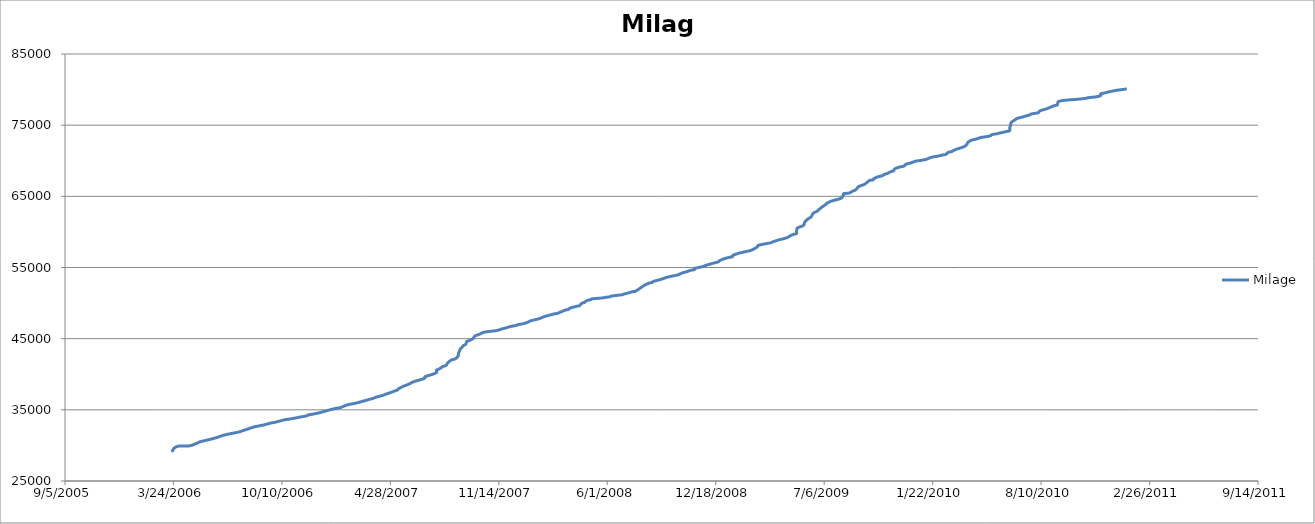
| Category | Milage |
|---|---|
| 38796.0 | 29142 |
| 38799.0 | 29300 |
| 38801.0 | 29600 |
| 38809.0 | 29895 |
| 38831.0 | 29958 |
| 38849.0 | 30505 |
| 38856.0 | 30636 |
| 38868.0 | 30858 |
| 38874.0 | 30979 |
| 38881.0 | 31136 |
| 38892.0 | 31427 |
| 38906.0 | 31661 |
| 38919.0 | 31859 |
| 38925.0 | 31992 |
| 38936.0 | 32274 |
| 38947.0 | 32562 |
| 38961.0 | 32791 |
| 38967.0 | 32882 |
| 38982.0 | 33194 |
| 38985.0 | 33208 |
| 38998.0 | 33465 |
| 39006.0 | 33617 |
| 39017.0 | 33739 |
| 39034.0 | 33988 |
| 39044.0 | 34125 |
| 39050.0 | 34301 |
| 39060.0 | 34436 |
| 39073.0 | 34668 |
| 39084.0 | 34906 |
| 39091.0 | 35045 |
| 39099.0 | 35202 |
| 39108.0 | 35310 |
| 39110.0 | 35381 |
| 39122.0 | 35726 |
| 39133.0 | 35882 |
| 39141.0 | 36031 |
| 39148.0 | 36183 |
| 39155.0 | 36325 |
| 39161.0 | 36466 |
| 39168.0 | 36601 |
| 39173.0 | 36759 |
| 39187.0 | 37054 |
| 39190.0 | 37166 |
| 39197.0 | 37335 |
| 39202.0 | 37474 |
| 39210.0 | 37707 |
| 39213.0 | 37788 |
| 39215.0 | 37974 |
| 39217.0 | 38030 |
| 39223.0 | 38281 |
| 39231.0 | 38514 |
| 39234.0 | 38609 |
| 39243.0 | 38957 |
| 39249.0 | 39078 |
| 39250.0 | 39110 |
| 39263.0 | 39430 |
| 39264.0 | 39651 |
| 39276.0 | 39949 |
| 39285.0 | 40235 |
| 39285.0 | 40581 |
| 39290.0 | 40739 |
| 39297.0 | 41092 |
| 39303.0 | 41252 |
| 39306.0 | 41617 |
| 39313.0 | 42025 |
| 39320.0 | 42165 |
| 39325.0 | 42569 |
| 39325.0 | 42607 |
| 39326.0 | 43007 |
| 39326.0 | 43022 |
| 39328.0 | 43325 |
| 39329.0 | 43577 |
| 39332.0 | 43762 |
| 39334.0 | 43986 |
| 39339.0 | 44218 |
| 39341.0 | 44604 |
| 39346.0 | 44750 |
| 39349.0 | 44852 |
| 39353.0 | 45065 |
| 39356.0 | 45375 |
| 39363.0 | 45576 |
| 39366.0 | 45681 |
| 39371.0 | 45874 |
| 39379.0 | 45987 |
| 39392.0 | 46097 |
| 39402.0 | 46255 |
| 39405.0 | 46361 |
| 39413.0 | 46497 |
| 39417.0 | 46610 |
| 39422.0 | 46718 |
| 39432.0 | 46863 |
| 39436.0 | 46980 |
| 39444.0 | 47089 |
| 39450.0 | 47211 |
| 39454.0 | 47327 |
| 39457.0 | 47459 |
| 39462.0 | 47577 |
| 39469.0 | 47695 |
| 39475.0 | 47826 |
| 39479.0 | 47947 |
| 39483.0 | 48085 |
| 39487.0 | 48170 |
| 39503.0 | 48498 |
| 39507.0 | 48530 |
| 39517.0 | 48837 |
| 39520.0 | 48949 |
| 39525.0 | 49054 |
| 39529.0 | 49145 |
| 39532.0 | 49315 |
| 39539.0 | 49459 |
| 39545.0 | 49573 |
| 39549.0 | 49640 |
| 39551.0 | 49840 |
| 39554.0 | 50000 |
| 39556.0 | 50052 |
| 39557.0 | 50055 |
| 39563.0 | 50366 |
| 39570.0 | 50494 |
| 39572.0 | 50596 |
| 39590.0 | 50713 |
| 39596.0 | 50794 |
| 39605.0 | 50887 |
| 39607.0 | 50972 |
| 39615.0 | 51059 |
| 39628.0 | 51181 |
| 39631.0 | 51273 |
| 39634.0 | 51333 |
| 39639.0 | 51431 |
| 39642.0 | 51500 |
| 39648.0 | 51622 |
| 39653.0 | 51706 |
| 39668.0 | 52484 |
| 39675.0 | 52740 |
| 39678.0 | 52836 |
| 39683.0 | 52896 |
| 39684.0 | 53010 |
| 39691.0 | 53177 |
| 39696.0 | 53266 |
| 39710.0 | 53617 |
| 39715.0 | 53720 |
| 39722.0 | 53827 |
| 39728.0 | 53921 |
| 39730.0 | 53957 |
| 39740.0 | 54283 |
| 39745.0 | 54365 |
| 39750.0 | 54517 |
| 39756.0 | 54638 |
| 39761.0 | 54708 |
| 39761.0 | 54871 |
| 39775.0 | 55109 |
| 39785.0 | 55383 |
| 39793.0 | 55552 |
| 39801.0 | 55708 |
| 39805.0 | 55809 |
| 39808.0 | 56000 |
| 39817.0 | 56269 |
| 39827.0 | 56461 |
| 39831.0 | 56521 |
| 39832.0 | 56726 |
| 39843.0 | 57016 |
| 39853.0 | 57192 |
| 39865.0 | 57407 |
| 39872.0 | 57672 |
| 39877.0 | 57909 |
| 39879.0 | 58127 |
| 39897.0 | 58406 |
| 39900.0 | 58452 |
| 39911.0 | 58756 |
| 39918.0 | 58913 |
| 39926.0 | 59063 |
| 39933.0 | 59240 |
| 39936.0 | 59400 |
| 39942.0 | 59611 |
| 39949.0 | 59773 |
| 39949.0 | 60000 |
| 39950.0 | 60503 |
| 39954.0 | 60666 |
| 39960.0 | 60841 |
| 39963.0 | 61031 |
| 39964.0 | 61366 |
| 39969.0 | 61757 |
| 39972.0 | 61913 |
| 39976.0 | 62102 |
| 39976.0 | 62132 |
| 39978.0 | 62383 |
| 39980.0 | 62650 |
| 39984.0 | 62785 |
| 39988.0 | 62975 |
| 39990.0 | 63138 |
| 39992.0 | 63238 |
| 39995.0 | 63456 |
| 39999.0 | 63646 |
| 40002.0 | 63785 |
| 40004.0 | 63977 |
| 40008.0 | 64149 |
| 40012.0 | 64300 |
| 40018.0 | 64429 |
| 40032.0 | 64747 |
| 40033.0 | 64920 |
| 40036.0 | 65235 |
| 40036.0 | 65383 |
| 40046.0 | 65460 |
| 40053.0 | 65753 |
| 40057.0 | 65854 |
| 40058.0 | 65928 |
| 40060.0 | 66066 |
| 40063.0 | 66341 |
| 40068.0 | 66510 |
| 40074.0 | 66678 |
| 40080.0 | 67014 |
| 40083.0 | 67204 |
| 40087.0 | 67285 |
| 40090.0 | 67310 |
| 40091.0 | 67451 |
| 40096.0 | 67660 |
| 40099.0 | 67742 |
| 40107.0 | 67895 |
| 40110.0 | 68055 |
| 40115.0 | 68175 |
| 40118.0 | 68269 |
| 40123.0 | 68476 |
| 40128.0 | 68592 |
| 40130.0 | 68858 |
| 40140.0 | 69139 |
| 40146.0 | 69217 |
| 40150.0 | 69437 |
| 40151.0 | 69529 |
| 40159.0 | 69674 |
| 40169.0 | 69948 |
| 40179.0 | 70046 |
| 40186.0 | 70172 |
| 40188.0 | 70194 |
| 40198.0 | 70494 |
| 40207.0 | 70611 |
| 40214.0 | 70731 |
| 40221.0 | 70853 |
| 40224.0 | 70875 |
| 40229.0 | 71184 |
| 40235.0 | 71286 |
| 40237.0 | 71370 |
| 40243.0 | 71596 |
| 40253.0 | 71843 |
| 40257.0 | 71955 |
| 40260.0 | 72064 |
| 40263.0 | 72282 |
| 40265.0 | 72588 |
| 40269.0 | 72780 |
| 40271.0 | 72881 |
| 40282.0 | 73084 |
| 40288.0 | 73255 |
| 40299.0 | 73387 |
| 40307.0 | 73512 |
| 40309.0 | 73664 |
| 40317.0 | 73768 |
| 40324.0 | 73896 |
| 40332.0 | 74031 |
| 40338.0 | 74145 |
| 40342.0 | 74207 |
| 40342.0 | 74587 |
| 40343.0 | 74795 |
| 40344.0 | 75100 |
| 40345.0 | 75386 |
| 40352.0 | 75751 |
| 40355.0 | 75923 |
| 40361.0 | 76051 |
| 40367.0 | 76176 |
| 40373.0 | 76310 |
| 40379.0 | 76439 |
| 40382.0 | 76576 |
| 40391.0 | 76690 |
| 40395.0 | 76747 |
| 40398.0 | 77015 |
| 40410.0 | 77289 |
| 40413.0 | 77392 |
| 40423.0 | 77701 |
| 40429.0 | 77827 |
| 40430.0 | 77847 |
| 40431.0 | 78217 |
| 40433.0 | 78359 |
| 40445.0 | 78506 |
| 40466.0 | 78633 |
| 40481.0 | 78757 |
| 40488.0 | 78869 |
| 40503.0 | 78993 |
| 40508.0 | 79113 |
| 40510.0 | 79150 |
| 40510.0 | 79398 |
| 40520.0 | 79575 |
| 40525.0 | 79681 |
| 40532.0 | 79793 |
| 40540.0 | 79912 |
| 40551.0 | 80013 |
| 40558.0 | 80110 |